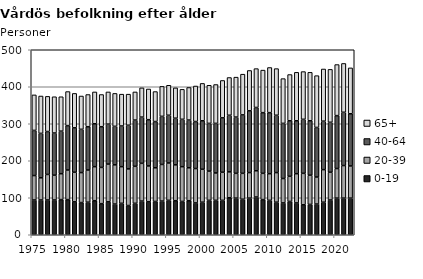
| Category | 0-19 | 20-39 | 40-64 | 65+ |
|---|---|---|---|---|
| 1975.0 | 94 | 66 | 122 | 96 |
| 1976.0 | 94 | 60 | 120 | 101 |
| 1977.0 | 94 | 69 | 116 | 95 |
| 1978.0 | 94 | 67 | 114 | 98 |
| 1979.0 | 95 | 70 | 115 | 93 |
| 1980.0 | 95 | 80 | 120 | 92 |
| 1981.0 | 89 | 80 | 120 | 93 |
| 1982.0 | 87 | 81 | 117 | 90 |
| 1983.0 | 88 | 87 | 117 | 87 |
| 1984.0 | 92 | 92 | 116 | 86 |
| 1985.0 | 84 | 98 | 110 | 87 |
| 1986.0 | 89 | 102 | 108 | 87 |
| 1987.0 | 83 | 106 | 104 | 89 |
| 1988.0 | 85 | 99 | 110 | 86 |
| 1989.0 | 79 | 99 | 118 | 84 |
| 1990.0 | 85 | 100 | 125 | 76 |
| 1991.0 | 91 | 102 | 125 | 79 |
| 1992.0 | 89 | 97 | 125 | 83 |
| 1993.0 | 90 | 91 | 125 | 81 |
| 1994.0 | 91 | 99 | 130 | 81 |
| 1995.0 | 93 | 101 | 129 | 81 |
| 1996.0 | 92 | 97 | 126 | 82 |
| 1997.0 | 90 | 94 | 128 | 81 |
| 1998.0 | 92 | 89 | 129 | 88 |
| 1999.0 | 86 | 93 | 127 | 96 |
| 2000.0 | 88 | 89 | 131 | 101 |
| 2001.0 | 93 | 79 | 129 | 103 |
| 2002.0 | 93 | 74 | 134 | 105 |
| 2003.0 | 93 | 76 | 147 | 101 |
| 2004.0 | 100 | 70 | 153 | 102 |
| 2005.0 | 99 | 67 | 152 | 108 |
| 2006.0 | 96 | 70 | 158 | 110 |
| 2007.0 | 99 | 69 | 167 | 109 |
| 2008.0 | 102 | 71 | 171 | 105 |
| 2009.0 | 95 | 71 | 164 | 115 |
| 2010.0 | 93 | 72 | 165 | 122 |
| 2011.0 | 88 | 80 | 155 | 126 |
| 2012.0 | 86 | 66 | 149 | 121 |
| 2013.0 | 90 | 68 | 150 | 125 |
| 2014.0 | 86 | 79 | 143 | 131 |
| 2015.0 | 81 | 85 | 146 | 129 |
| 2016.0 | 82 | 79 | 147 | 131 |
| 2017.0 | 83 | 73 | 134 | 140 |
| 2018.0 | 88 | 88 | 131 | 141 |
| 2019.0 | 94 | 75 | 135 | 143 |
| 2020.0 | 99 | 80 | 143 | 138 |
| 2021.0 | 99 | 88 | 144 | 132 |
| 2022.0 | 99 | 87 | 141 | 124 |